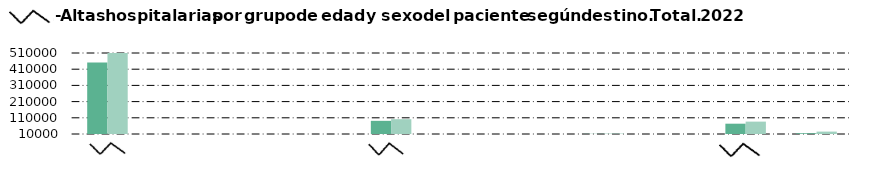
| Category |     Hombre |     Mujer |
|---|---|---|
| Alta médica | 450786 | 566834 |
| Alta voluntaria | 130 | 194 |
| Fallecimiento | 16 | 17 |
| Centro sociosanitario | 15 | 4 |
| Consulta hospitalaria | 91279 | 101414 |
| Urgencias | 255 | 258 |
| Cirugía ambulatoria | 258 | 437 |
| Atención primaria | 10953 | 12431 |
| Otro hospital | 2385 | 2600 |
| Continuación de tratamiento | 73622 | 86407 |
| No consta | 14688 | 24795 |